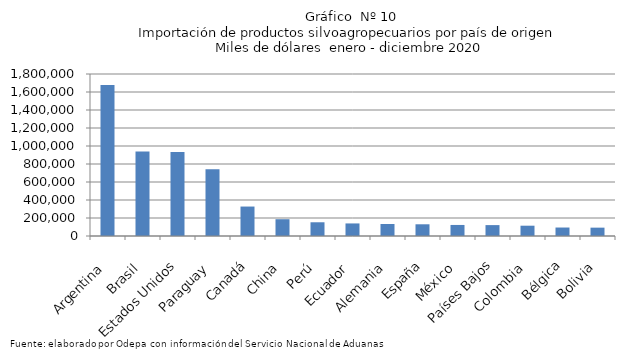
| Category | Series 0 |
|---|---|
| Argentina | 1678209.236 |
| Brasil | 939815.656 |
| Estados Unidos | 932456.217 |
| Paraguay | 742255.092 |
| Canadá | 327239.798 |
| China | 186416.171 |
| Perú | 152545.403 |
| Ecuador | 139624.318 |
| Alemania | 133491.867 |
| España | 130145.888 |
| México | 122710.773 |
| Países Bajos | 121088.757 |
| Colombia | 114424.528 |
| Bélgica | 94165.17 |
| Bolivia | 92805.93 |